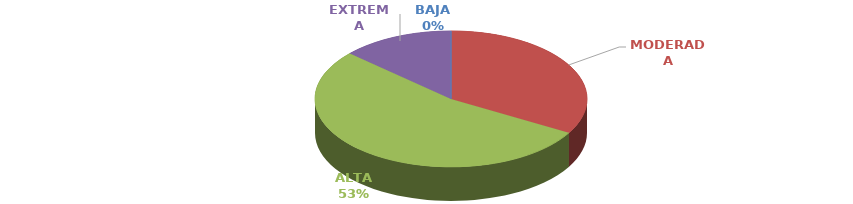
| Category | Series 0 |
|---|---|
| BAJA | 0 |
| MODERADA | 5 |
| ALTA | 8 |
| EXTREMA | 2 |